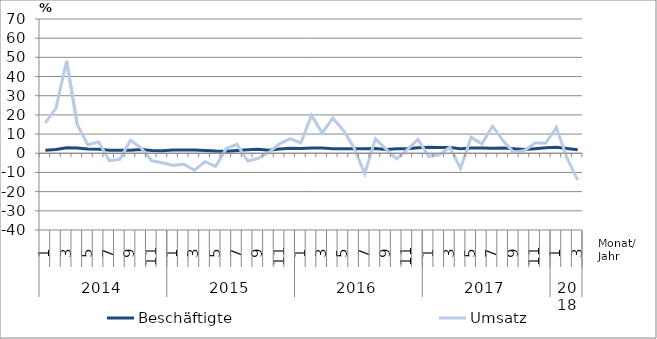
| Category | Beschäftigte | Umsatz |
|---|---|---|
| 0 | 1.6 | 15.9 |
| 1 | 2 | 23.5 |
| 2 | 2.9 | 48.2 |
| 3 | 2.8 | 14.9 |
| 4 | 2.2 | 4.5 |
| 5 | 2.1 | 6 |
| 6 | 1.6 | -3.9 |
| 7 | 1.6 | -3.2 |
| 8 | 1.6 | 6.8 |
| 9 | 2 | 2.7 |
| 10 | 1.4 | -3.9 |
| 11 | 1.3 | -4.9 |
| 12 | 1.7 | -6.3 |
| 13 | 1.7 | -5.7 |
| 14 | 1.7 | -8.8 |
| 15 | 1.5 | -4.4 |
| 16 | 1.2 | -6.8 |
| 17 | 1.1 | 2.5 |
| 18 | 1.5 | 4.7 |
| 19 | 1.8 | -4.1 |
| 20 | 2.1 | -2.6 |
| 21 | 1.6 | 0.5 |
| 22 | 2.2 | 4.9 |
| 23 | 2.6 | 7.6 |
| 24 | 2.5 | 5.3 |
| 25 | 2.7 | 19.9 |
| 26 | 2.8 | 10.5 |
| 27 | 2.4 | 18.3 |
| 28 | 2.4 | 11.9 |
| 29 | 2.4 | 2.8 |
| 30 | 2.3 | -10.7 |
| 31 | 2.5 | 7.5 |
| 32 | 2 | 2.2 |
| 33 | 2.4 | -2.9 |
| 34 | 2.3 | 1.9 |
| 35 | 2.9 | 7.2 |
| 36 | 3.1 | -1.6 |
| 37 | 3 | -0.8 |
| 38 | 3 | 3.1 |
| 39 | 2.4 | -7.9 |
| 40 | 2.8 | 8.3 |
| 41 | 2.7 | 4.9 |
| 42 | 2.6 | 14.1 |
| 43 | 2.7 | 6.5 |
| 44 | 2.3 | 0.4 |
| 45 | 2 | 1.4 |
| 46 | 2.4 | 5.3 |
| 47 | 2.9 | 5.4 |
| 48 | 3.1 | 13.4 |
| 49 | 2.5 | -2.4 |
| 50 | 1.8 | -14 |